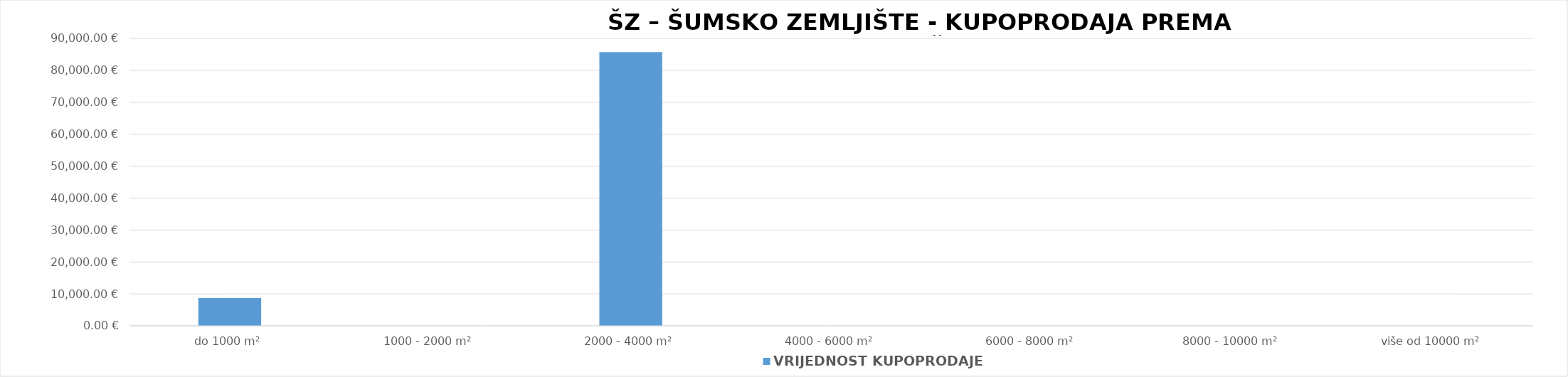
| Category | VRIJEDNOST KUPOPRODAJE 
(u EUR) |
|---|---|
| do 1000 m² | 8694.117 |
| 1000 - 2000 m² | 0 |
| 2000 - 4000 m² | 85688.689 |
| 4000 - 6000 m² | 0 |
| 6000 - 8000 m² | 0 |
| 8000 - 10000 m² | 0 |
| više od 10000 m² | 0 |